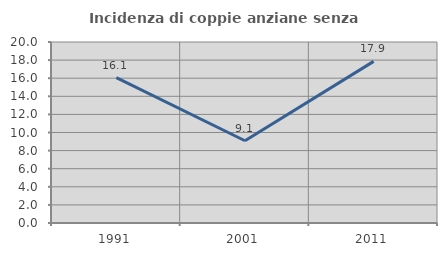
| Category | Incidenza di coppie anziane senza figli  |
|---|---|
| 1991.0 | 16.071 |
| 2001.0 | 9.091 |
| 2011.0 | 17.857 |